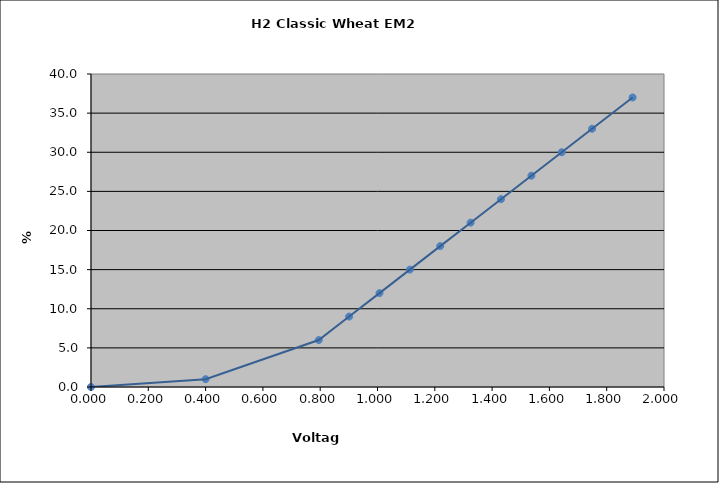
| Category | Generated Curve |
|---|---|
| 0.0 | 0 |
| 0.4 | 1 |
| 0.7950000000000002 | 6 |
| 0.9010000000000001 | 9 |
| 1.0070000000000001 | 12 |
| 1.1130000000000002 | 15 |
| 1.219 | 18 |
| 1.3250000000000002 | 21 |
| 1.4310000000000003 | 24 |
| 1.5370000000000001 | 27 |
| 1.6430000000000002 | 30 |
| 1.7490000000000003 | 33 |
| 1.8903333333333336 | 37 |